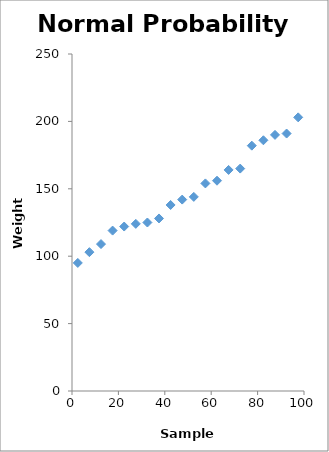
| Category | Series 0 |
|---|---|
| 2.5 | 95 |
| 7.5 | 103 |
| 12.5 | 109 |
| 17.5 | 119 |
| 22.5 | 122 |
| 27.5 | 124 |
| 32.5 | 125 |
| 37.5 | 128 |
| 42.5 | 138 |
| 47.5 | 142 |
| 52.5 | 144 |
| 57.5 | 154 |
| 62.5 | 156 |
| 67.5 | 164 |
| 72.5 | 165 |
| 77.5 | 182 |
| 82.5 | 186 |
| 87.5 | 190 |
| 92.5 | 191 |
| 97.5 | 203 |